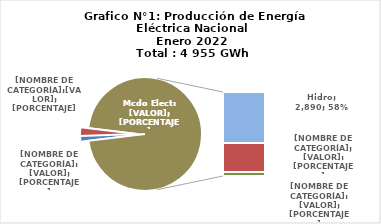
| Category | Series 0 |
|---|---|
| 0 | 66.059 |
| 1 | 122.681 |
| 2 | 2890.324 |
| 3 | 1653.425 |
| 4 | 222.272 |